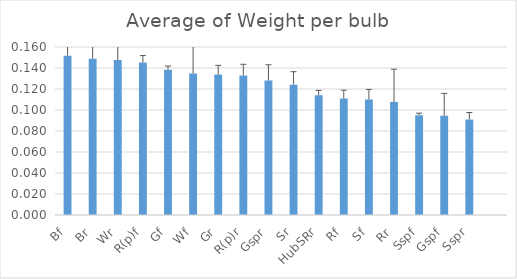
| Category | Average of Weight per bulb |
|---|---|
| Bf | 0.152 |
| Br | 0.149 |
| Wr | 0.148 |
| R(p)f | 0.145 |
| Gf | 0.138 |
| Wf | 0.135 |
| Gr | 0.134 |
| R(p)r | 0.133 |
| Gspr | 0.128 |
| Sr | 0.124 |
| HubSRr | 0.114 |
| Rf | 0.111 |
| Sf | 0.11 |
| Rr | 0.108 |
| Sspf | 0.095 |
| Gspf | 0.094 |
| Sspr | 0.091 |